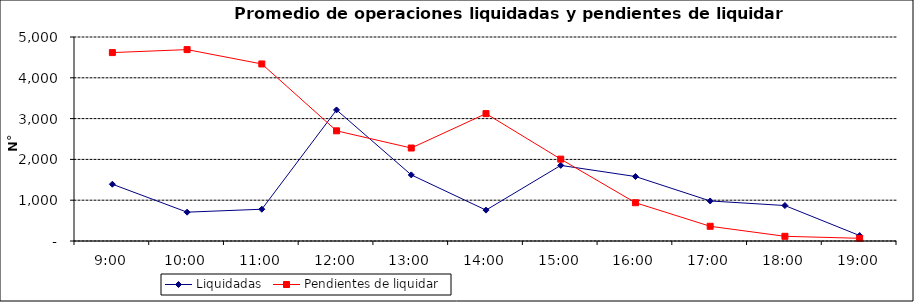
| Category | Liquidadas | Pendientes de liquidar |
|---|---|---|
| 0.375 | 1391.864 | 4618.045 |
| 0.4166666666666667 | 706.773 | 4691.273 |
| 0.4583333333333333 | 778.864 | 4339.273 |
| 0.5 | 3212.364 | 2700.364 |
| 0.5416666666666666 | 1620.045 | 2278.955 |
| 0.5833333333333334 | 756.864 | 3122.182 |
| 0.625 | 1853.455 | 2006.727 |
| 0.6666666666666666 | 1580.136 | 938.045 |
| 0.7083333333333334 | 981.364 | 360.5 |
| 0.75 | 869.182 | 115 |
| 0.7916666666666666 | 132.864 | 66.182 |